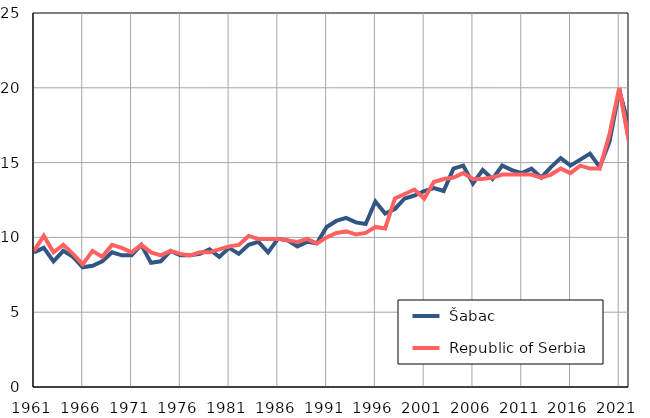
| Category |  Šabac |  Republic of Serbia |
|---|---|---|
| 1961.0 | 9 | 9.1 |
| 1962.0 | 9.3 | 10.1 |
| 1963.0 | 8.4 | 9 |
| 1964.0 | 9.1 | 9.5 |
| 1965.0 | 8.7 | 8.9 |
| 1966.0 | 8 | 8.2 |
| 1967.0 | 8.1 | 9.1 |
| 1968.0 | 8.4 | 8.7 |
| 1969.0 | 9 | 9.5 |
| 1970.0 | 8.8 | 9.3 |
| 1971.0 | 8.8 | 9 |
| 1972.0 | 9.5 | 9.5 |
| 1973.0 | 8.3 | 9 |
| 1974.0 | 8.4 | 8.8 |
| 1975.0 | 9.1 | 9.1 |
| 1976.0 | 8.8 | 8.9 |
| 1977.0 | 8.8 | 8.8 |
| 1978.0 | 8.9 | 9 |
| 1979.0 | 9.2 | 9 |
| 1980.0 | 8.7 | 9.2 |
| 1981.0 | 9.3 | 9.4 |
| 1982.0 | 8.9 | 9.5 |
| 1983.0 | 9.5 | 10.1 |
| 1984.0 | 9.7 | 9.9 |
| 1985.0 | 9 | 9.9 |
| 1986.0 | 9.9 | 9.9 |
| 1987.0 | 9.8 | 9.8 |
| 1988.0 | 9.4 | 9.7 |
| 1989.0 | 9.7 | 9.9 |
| 1990.0 | 9.6 | 9.6 |
| 1991.0 | 10.7 | 10 |
| 1992.0 | 11.1 | 10.3 |
| 1993.0 | 11.3 | 10.4 |
| 1994.0 | 11 | 10.2 |
| 1995.0 | 10.9 | 10.3 |
| 1996.0 | 12.4 | 10.7 |
| 1997.0 | 11.6 | 10.6 |
| 1998.0 | 11.9 | 12.6 |
| 1999.0 | 12.6 | 12.9 |
| 2000.0 | 12.8 | 13.2 |
| 2001.0 | 13.1 | 12.6 |
| 2002.0 | 13.3 | 13.7 |
| 2003.0 | 13.1 | 13.9 |
| 2004.0 | 14.6 | 14 |
| 2005.0 | 14.8 | 14.3 |
| 2006.0 | 13.6 | 13.9 |
| 2007.0 | 14.5 | 13.9 |
| 2008.0 | 13.9 | 14 |
| 2009.0 | 14.8 | 14.2 |
| 2010.0 | 14.5 | 14.2 |
| 2011.0 | 14.3 | 14.2 |
| 2012.0 | 14.6 | 14.2 |
| 2013.0 | 14 | 14 |
| 2014.0 | 14.7 | 14.2 |
| 2015.0 | 15.3 | 14.6 |
| 2016.0 | 14.8 | 14.3 |
| 2017.0 | 15.2 | 14.8 |
| 2018.0 | 15.6 | 14.6 |
| 2019.0 | 14.7 | 14.6 |
| 2020.0 | 16.4 | 16.9 |
| 2021.0 | 19.8 | 20 |
| 2022.0 | 17.4 | 16.4 |